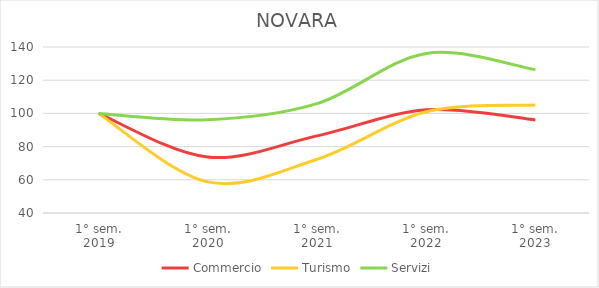
| Category | Commercio | Turismo | Servizi |
|---|---|---|---|
| 1° sem.
2019 | 100 | 100 | 100 |
| 1° sem.
2020 | 73.673 | 58.743 | 96.123 |
| 1° sem.
2021 | 86.442 | 72.354 | 105.852 |
| 1° sem.
2022 | 102.188 | 100.958 | 136.144 |
| 1° sem.
2023 | 96.09 | 105.069 | 126.322 |